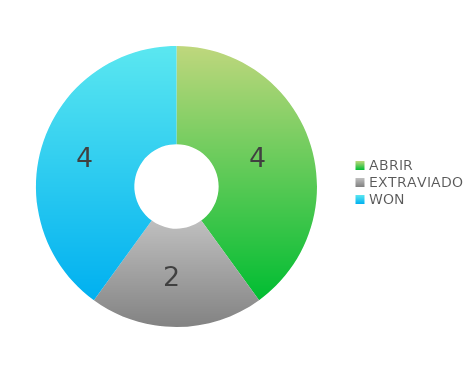
| Category | Series 0 |
|---|---|
| ABRIR | 4 |
| EXTRAVIADO | 2 |
| WON | 4 |